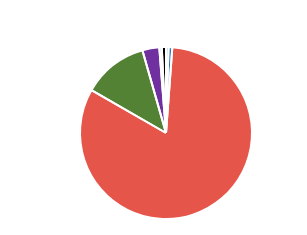
| Category | Series 0 |
|---|---|
| PC | 489 |
| MC | 742 |
| CAR | 86070 |
| LGV | 12848 |
| OGV1 | 3334 |
| OGV2 | 480 |
| PSV | 828 |